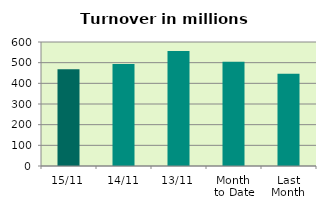
| Category | Series 0 |
|---|---|
| 15/11 | 468.016 |
| 14/11 | 493.941 |
| 13/11 | 556.101 |
| Month 
to Date | 505.017 |
| Last
Month | 446.481 |